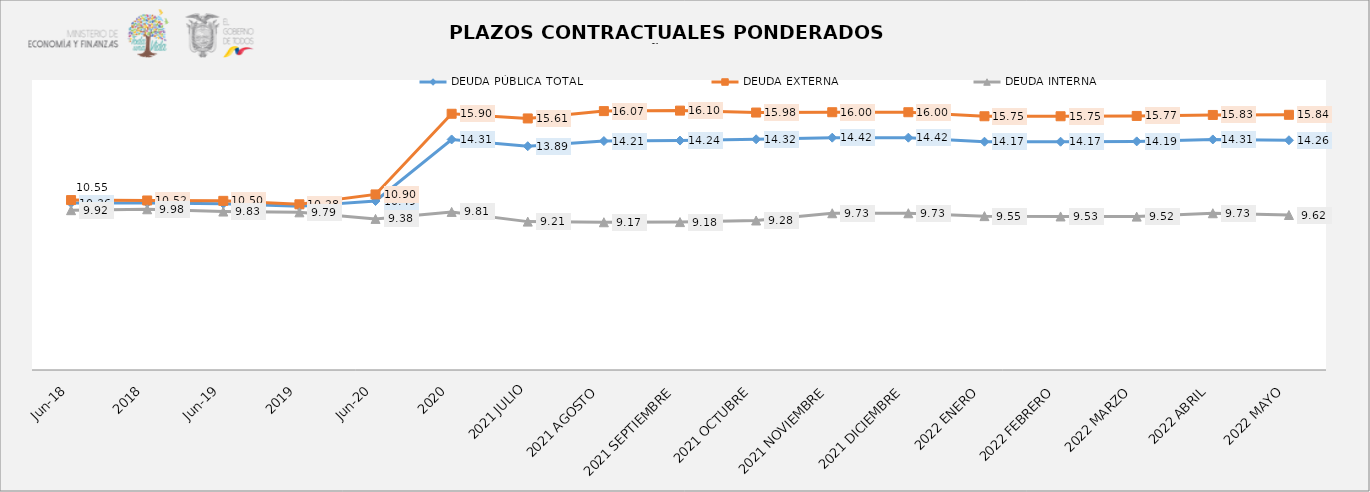
| Category | DEUDA PÚBLICA TOTAL | DEUDA EXTERNA  | DEUDA INTERNA |
|---|---|---|---|
| jun-18 | 10.364 | 10.547 | 9.919 |
| 2018 | 10.371 | 10.522 | 9.976 |
| jun-19 | 10.321 | 10.498 | 9.835 |
| 2019 | 10.156 | 10.284 | 9.786 |
| jun-20 | 10.488 | 10.898 | 9.379 |
| 2020 | 14.309 | 15.905 | 9.812 |
| 2021 JULIO | 13.89 | 15.614 | 9.21 |
| 2021 AGOSTO | 14.21 | 16.07 | 9.17 |
| 2021 SEPTIEMBRE | 14.24 | 16.1 | 9.18 |
| 2021 OCTUBRE | 14.32 | 15.98 | 9.28 |
| 2021 NOVIEMBRE | 14.42 | 16 | 9.73 |
| 2021 DICIEMBRE | 14.42 | 16 | 9.73 |
| 2022 ENERO | 14.17 | 15.75 | 9.55 |
| 2022 FEBRERO | 14.17 | 15.75 | 9.53 |
| 2022 MARZO | 14.19 | 15.77 | 9.52 |
| 2022 ABRIL | 14.31 | 15.83 | 9.73 |
| 2022 MAYO | 14.26 | 15.84 | 9.62 |